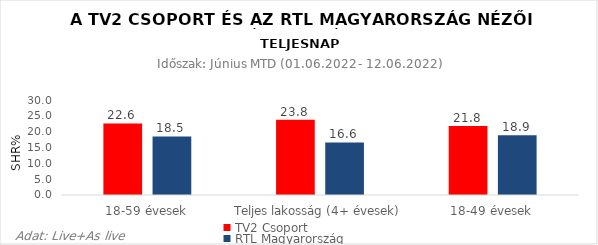
| Category | TV2 Csoport | RTL Magyarország |
|---|---|---|
| 18-59 évesek | 22.6 | 18.5 |
| Teljes lakosság (4+ évesek) | 23.8 | 16.6 |
| 18-49 évesek | 21.8 | 18.9 |